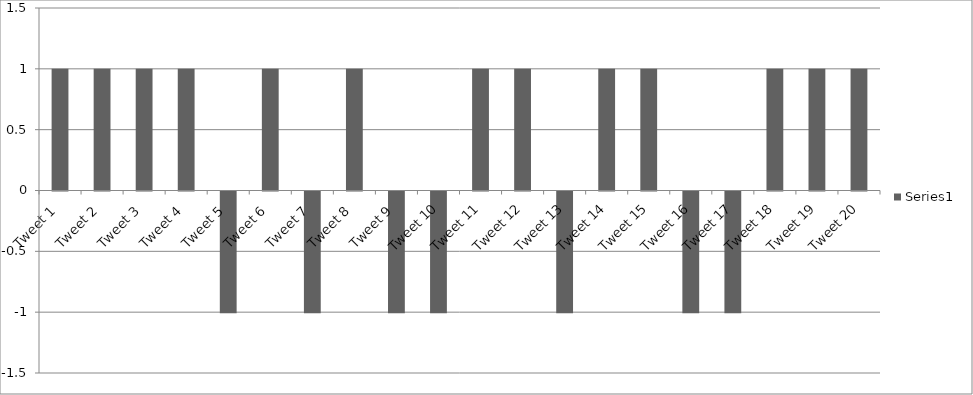
| Category | Series 0 |
|---|---|
| Tweet 1 | 1 |
| Tweet 2 | 1 |
| Tweet 3 | 1 |
| Tweet 4 | 1 |
| Tweet 5 | -1 |
| Tweet 6 | 1 |
| Tweet 7 | -1 |
| Tweet 8 | 1 |
| Tweet 9 | -1 |
| Tweet 10 | -1 |
| Tweet 11 | 1 |
| Tweet 12 | 1 |
| Tweet 13 | -1 |
| Tweet 14 | 1 |
| Tweet 15 | 1 |
| Tweet 16 | -1 |
| Tweet 17 | -1 |
| Tweet 18 | 1 |
| Tweet 19 | 1 |
| Tweet 20 | 1 |